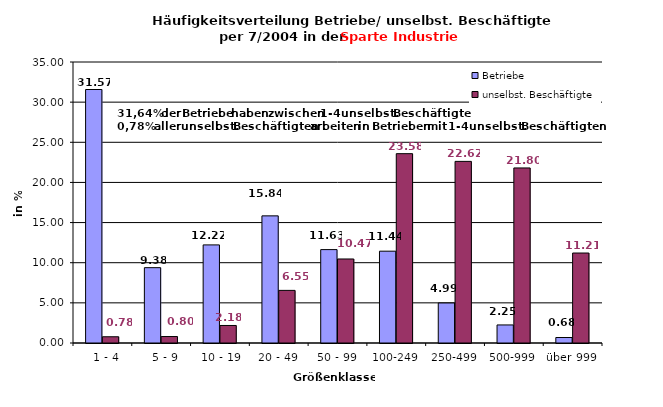
| Category | Betriebe | unselbst. Beschäftigte |
|---|---|---|
|   1 - 4 | 31.574 | 0.778 |
|   5 - 9 | 9.384 | 0.805 |
|  10 - 19 | 12.219 | 2.182 |
| 20 - 49 | 15.836 | 6.555 |
| 50 - 99 | 11.632 | 10.465 |
| 100-249 | 11.437 | 23.582 |
| 250-499 | 4.985 | 22.622 |
| 500-999 | 2.248 | 21.803 |
| über 999 | 0.684 | 11.207 |